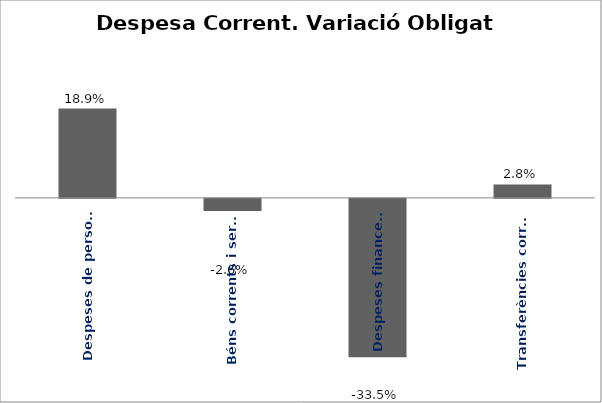
| Category | Series 0 |
|---|---|
| Despeses de personal | 0.189 |
| Béns corrents i serveis | -0.026 |
| Despeses financeres | -0.335 |
| Transferències corrents | 0.028 |